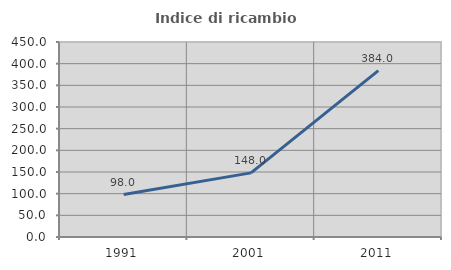
| Category | Indice di ricambio occupazionale  |
|---|---|
| 1991.0 | 98.02 |
| 2001.0 | 147.973 |
| 2011.0 | 383.951 |